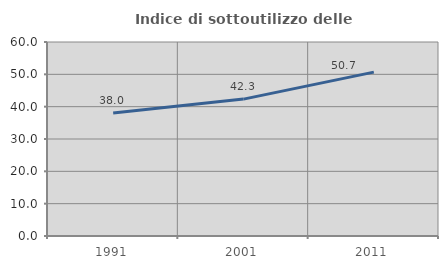
| Category | Indice di sottoutilizzo delle abitazioni  |
|---|---|
| 1991.0 | 38.043 |
| 2001.0 | 42.336 |
| 2011.0 | 50.679 |